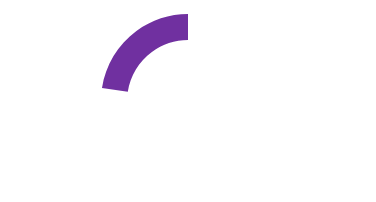
| Category | Series 0 |
|---|---|
| 0 | 77.4 |
| 1 | 22.6 |